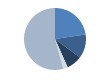
| Category | Series 0 |
|---|---|
| 0 | 340 |
| 1 | 188 |
| 2 | 122 |
| 3 | 36 |
| 4 | 815 |